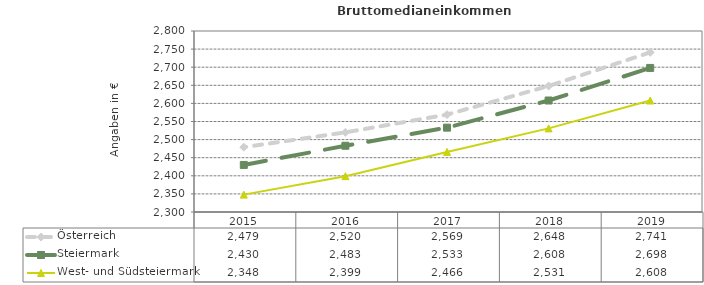
| Category | Österreich | Steiermark | West- und Südsteiermark |
|---|---|---|---|
| 2019.0 | 2741 | 2698 | 2608 |
| 2018.0 | 2648 | 2608 | 2531 |
| 2017.0 | 2569 | 2533 | 2466 |
| 2016.0 | 2520 | 2483 | 2399 |
| 2015.0 | 2479 | 2430 | 2348 |